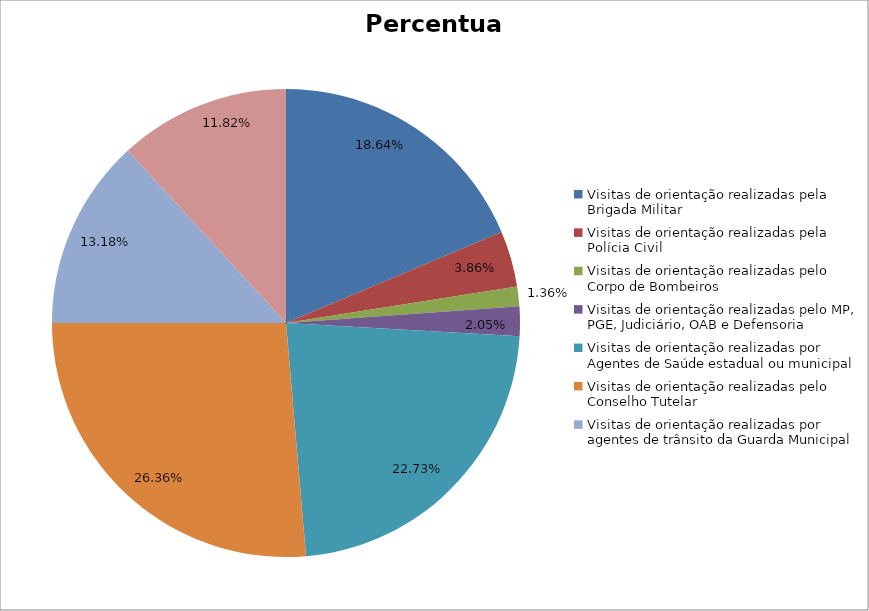
| Category | Percentual |
|---|---|
| Visitas de orientação realizadas pela Brigada Militar | 0.186 |
| Visitas de orientação realizadas pela Polícia Civil | 0.039 |
| Visitas de orientação realizadas pelo Corpo de Bombeiros | 0.014 |
| Visitas de orientação realizadas pelo MP, PGE, Judiciário, OAB e Defensoria | 0.02 |
| Visitas de orientação realizadas por Agentes de Saúde estadual ou municipal | 0.227 |
| Visitas de orientação realizadas pelo Conselho Tutelar | 0.264 |
| Visitas de orientação realizadas por agentes de trânsito da Guarda Municipal | 0.132 |
| Visitas de orientação realizadas por ONGs, entidades privadas, CRAS e CREAS | 0.118 |